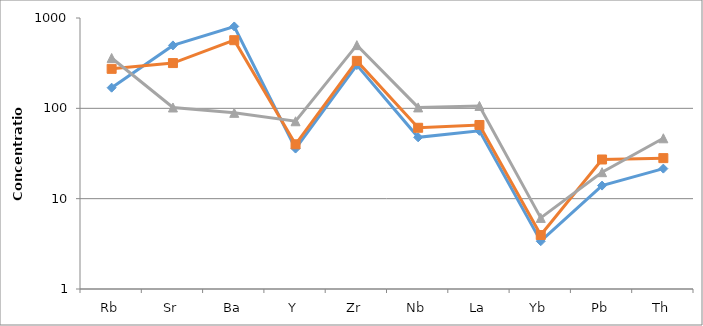
| Category | Series 0 | Series 1 | Series 2 |
|---|---|---|---|
| Rb | 169.261 | 273.658 | 361.069 |
| Sr | 497.454 | 317.006 | 102.177 |
| Ba | 806.048 | 567.85 | 89.152 |
| Y | 35.851 | 39.983 | 71.929 |
| Zr | 301.164 | 335.23 | 500.769 |
| Nb | 47.766 | 60.93 | 102.384 |
| La | 56.353 | 65.388 | 106.371 |
| Yb | 3.379 | 3.955 | 6.127 |
| Pb | 13.956 | 27.147 | 19.642 |
| Th | 21.513 | 28.106 | 46.602 |